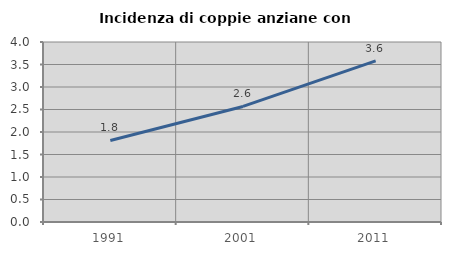
| Category | Incidenza di coppie anziane con figli |
|---|---|
| 1991.0 | 1.811 |
| 2001.0 | 2.568 |
| 2011.0 | 3.58 |